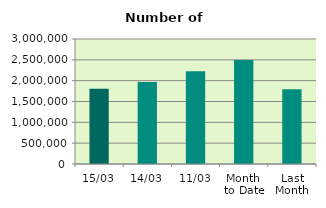
| Category | Series 0 |
|---|---|
| 15/03 | 1805748 |
| 14/03 | 1966250 |
| 11/03 | 2228210 |
| Month 
to Date | 2496289.818 |
| Last
Month | 1795830.8 |